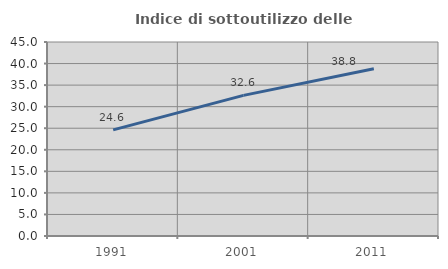
| Category | Indice di sottoutilizzo delle abitazioni  |
|---|---|
| 1991.0 | 24.609 |
| 2001.0 | 32.618 |
| 2011.0 | 38.814 |